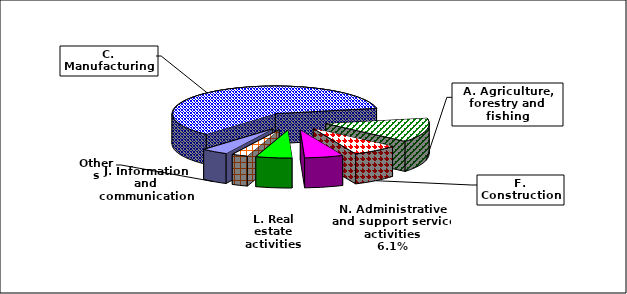
| Category | Series 0 |
|---|---|
| C. Manufacturing | 21795.136 |
| A. Agriculture, forestry and fishing | 5146.317 |
| F. Construction | 2610.4 |
| N. Administrative and support service activities | 2193.469 |
| L. Real estate activities | 2047.337 |
| J. Information and communication | 908.375 |
| Others | 1509.629 |